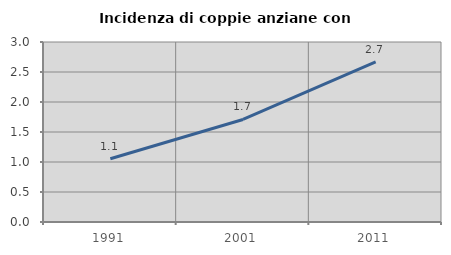
| Category | Incidenza di coppie anziane con figli |
|---|---|
| 1991.0 | 1.055 |
| 2001.0 | 1.709 |
| 2011.0 | 2.667 |